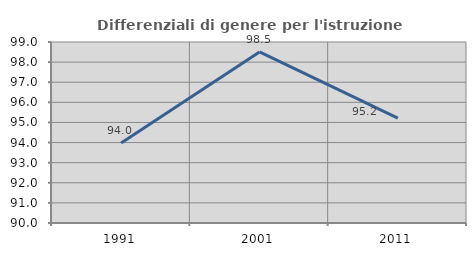
| Category | Differenziali di genere per l'istruzione superiore |
|---|---|
| 1991.0 | 93.983 |
| 2001.0 | 98.507 |
| 2011.0 | 95.214 |